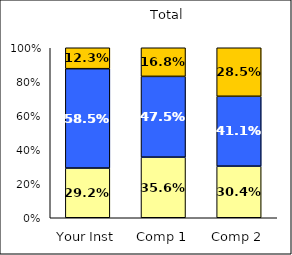
| Category | Low Scholarly Productivity | Average Scholarly Productivity | High Scholarly Productivity |
|---|---|---|---|
| Your Inst | 0.292 | 0.585 | 0.123 |
| Comp 1 | 0.356 | 0.475 | 0.168 |
| Comp 2 | 0.304 | 0.411 | 0.285 |